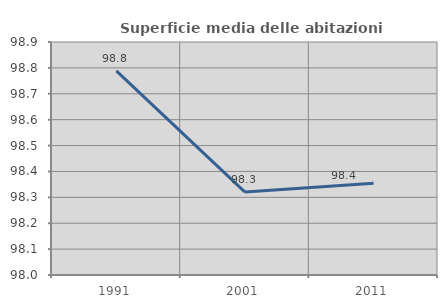
| Category | Superficie media delle abitazioni occupate |
|---|---|
| 1991.0 | 98.788 |
| 2001.0 | 98.32 |
| 2011.0 | 98.354 |